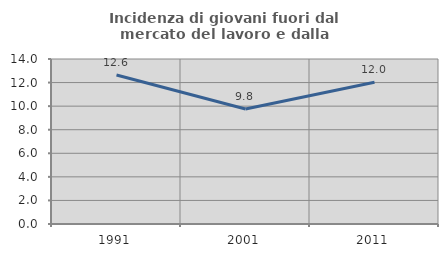
| Category | Incidenza di giovani fuori dal mercato del lavoro e dalla formazione  |
|---|---|
| 1991.0 | 12.644 |
| 2001.0 | 9.756 |
| 2011.0 | 12.03 |